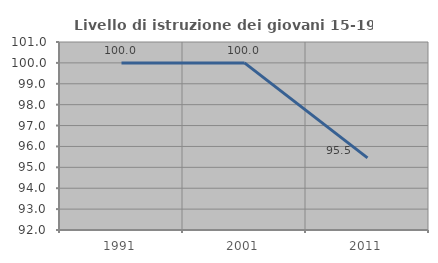
| Category | Livello di istruzione dei giovani 15-19 anni |
|---|---|
| 1991.0 | 100 |
| 2001.0 | 100 |
| 2011.0 | 95.455 |